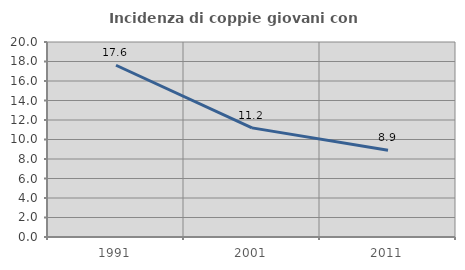
| Category | Incidenza di coppie giovani con figli |
|---|---|
| 1991.0 | 17.614 |
| 2001.0 | 11.193 |
| 2011.0 | 8.901 |